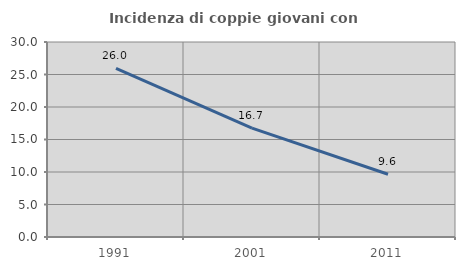
| Category | Incidenza di coppie giovani con figli |
|---|---|
| 1991.0 | 25.954 |
| 2001.0 | 16.738 |
| 2011.0 | 9.647 |